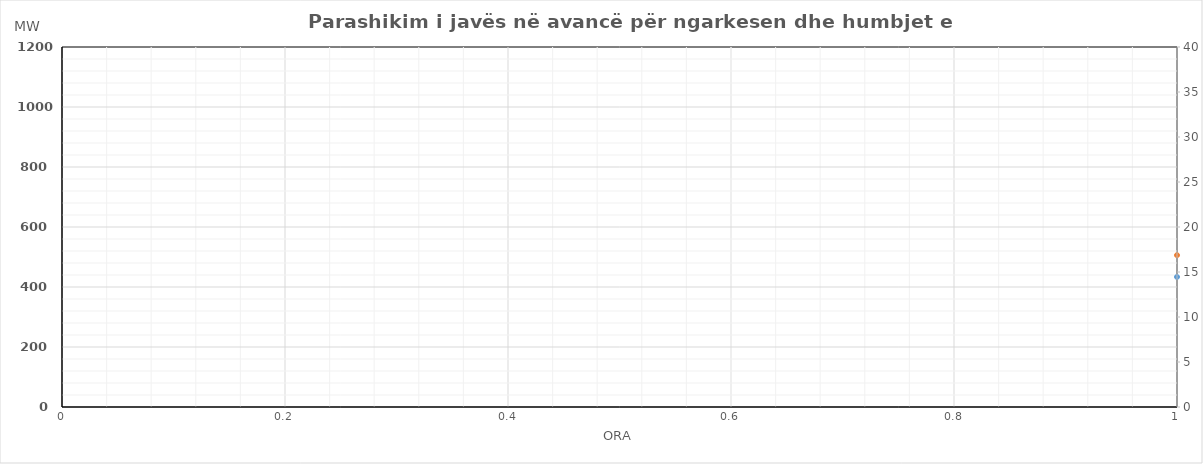
| Category | Ngarkesa (MWh) |
|---|---|
| 0 | 506.129 |
| 1 | 476.587 |
| 2 | 465.609 |
| 3 | 456.712 |
| 4 | 473.941 |
| 5 | 542.227 |
| 6 | 661.147 |
| 7 | 797.313 |
| 8 | 803.432 |
| 9 | 777.69 |
| 10 | 744.91 |
| 11 | 734.193 |
| 12 | 730.312 |
| 13 | 757.409 |
| 14 | 794.633 |
| 15 | 808.089 |
| 16 | 868.465 |
| 17 | 969.352 |
| 18 | 958.439 |
| 19 | 930.503 |
| 20 | 882.314 |
| 21 | 786.771 |
| 22 | 683.62 |
| 23 | 592.808 |
| 24 | 520.338 |
| 25 | 480.903 |
| 26 | 473.712 |
| 27 | 476.324 |
| 28 | 492.531 |
| 29 | 556.189 |
| 30 | 714.49 |
| 31 | 853.069 |
| 32 | 861.265 |
| 33 | 834.559 |
| 34 | 769.704 |
| 35 | 762.845 |
| 36 | 753.915 |
| 37 | 773.683 |
| 38 | 817.053 |
| 39 | 830.323 |
| 40 | 872.902 |
| 41 | 975.929 |
| 42 | 968.021 |
| 43 | 933.242 |
| 44 | 874.393 |
| 45 | 793.697 |
| 46 | 690.021 |
| 47 | 588.195 |
| 48 | 528.042 |
| 49 | 491.682 |
| 50 | 461.333 |
| 51 | 474.184 |
| 52 | 491.788 |
| 53 | 553.622 |
| 54 | 704.43 |
| 55 | 846.072 |
| 56 | 849.583 |
| 57 | 835.63 |
| 58 | 796.865 |
| 59 | 779.156 |
| 60 | 774.882 |
| 61 | 803.826 |
| 62 | 847.91 |
| 63 | 856.907 |
| 64 | 894.029 |
| 65 | 974.833 |
| 66 | 960.727 |
| 67 | 922.813 |
| 68 | 878.555 |
| 69 | 789.594 |
| 70 | 689.186 |
| 71 | 595.794 |
| 72 | 518.973 |
| 73 | 477.274 |
| 74 | 457.72 |
| 75 | 456.32 |
| 76 | 469.052 |
| 77 | 534.04 |
| 78 | 684.285 |
| 79 | 843.917 |
| 80 | 862.986 |
| 81 | 844.778 |
| 82 | 789.473 |
| 83 | 761.667 |
| 84 | 749.603 |
| 85 | 768.85 |
| 86 | 813.73 |
| 87 | 834.261 |
| 88 | 882.762 |
| 89 | 987.895 |
| 90 | 978.249 |
| 91 | 948.026 |
| 92 | 900.328 |
| 93 | 807.279 |
| 94 | 702.821 |
| 95 | 595.736 |
| 96 | 535.06 |
| 97 | 505.299 |
| 98 | 484.75 |
| 99 | 472.601 |
| 100 | 481.641 |
| 101 | 521.09 |
| 102 | 597.267 |
| 103 | 729.5 |
| 104 | 829.091 |
| 105 | 857.787 |
| 106 | 850.144 |
| 107 | 840.515 |
| 108 | 843.791 |
| 109 | 845.355 |
| 110 | 839.824 |
| 111 | 841.775 |
| 112 | 895.434 |
| 113 | 999.503 |
| 114 | 993.801 |
| 115 | 964.666 |
| 116 | 915.523 |
| 117 | 819.973 |
| 118 | 705.591 |
| 119 | 601.668 |
| 120 | 532.316 |
| 121 | 488.293 |
| 122 | 465.877 |
| 123 | 465.117 |
| 124 | 482.258 |
| 125 | 545.086 |
| 126 | 700.286 |
| 127 | 854.743 |
| 128 | 872.854 |
| 129 | 859.586 |
| 130 | 799.78 |
| 131 | 785.412 |
| 132 | 774.762 |
| 133 | 792.598 |
| 134 | 833.962 |
| 135 | 848.789 |
| 136 | 889.509 |
| 137 | 994.63 |
| 138 | 983.279 |
| 139 | 951.055 |
| 140 | 909.8 |
| 141 | 810.117 |
| 142 | 707.355 |
| 143 | 605.292 |
| 144 | 537.994 |
| 145 | 498.816 |
| 146 | 482.223 |
| 147 | 479.86 |
| 148 | 488.49 |
| 149 | 555.194 |
| 150 | 701.778 |
| 151 | 866.776 |
| 152 | 886.603 |
| 153 | 863.196 |
| 154 | 812.016 |
| 155 | 782.976 |
| 156 | 769.57 |
| 157 | 789.842 |
| 158 | 838.575 |
| 159 | 865.258 |
| 160 | 921.634 |
| 161 | 1026.876 |
| 162 | 1018.255 |
| 163 | 989.691 |
| 164 | 935.886 |
| 165 | 849.433 |
| 166 | 744.327 |
| 167 | 631.582 |